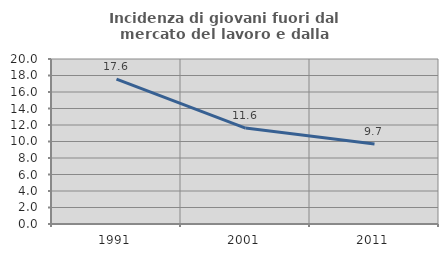
| Category | Incidenza di giovani fuori dal mercato del lavoro e dalla formazione  |
|---|---|
| 1991.0 | 17.563 |
| 2001.0 | 11.628 |
| 2011.0 | 9.687 |